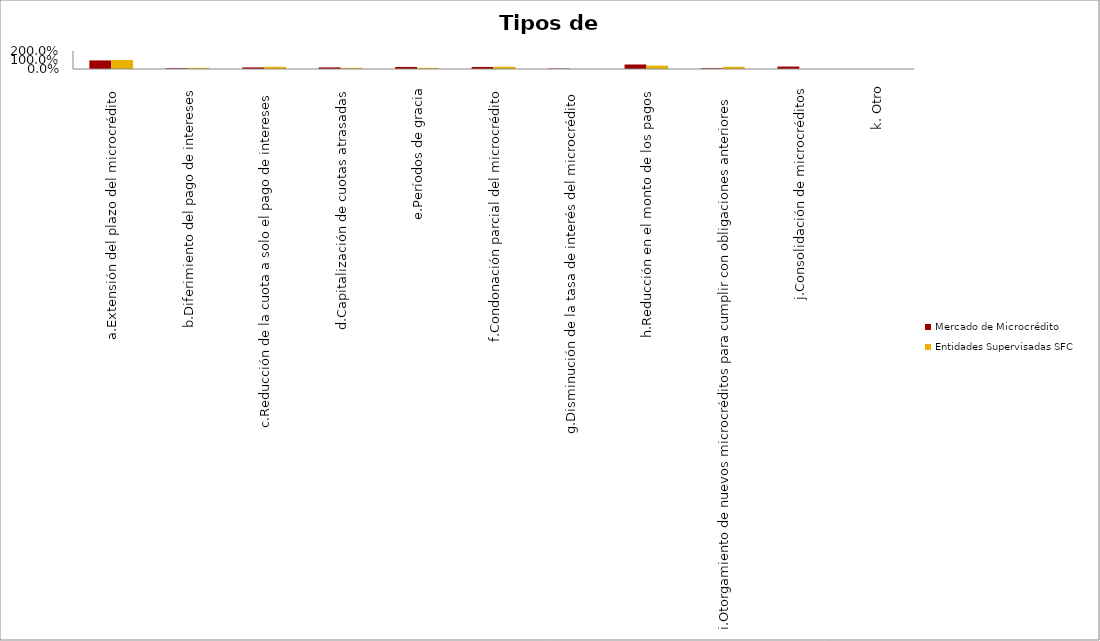
| Category | Mercado de Microcrédito | Entidades Supervisadas SFC |
|---|---|---|
| a.Extensión del plazo del microcrédito | 0.954 | 1 |
| b.Diferimiento del pago de intereses | 0.091 | 0.125 |
| c.Reducción de la cuota a solo el pago de intereses | 0.182 | 0.25 |
| d.Capitalización de cuotas atrasadas | 0.182 | 0.125 |
| e.Períodos de gracia | 0.227 | 0.125 |
| f.Condonación parcial del microcrédito | 0.227 | 0.25 |
| g.Disminución de la tasa de interés del microcrédito | 0.046 | 0 |
| h.Reducción en el monto de los pagos | 0.5 | 0.375 |
| i.Otorgamiento de nuevos microcréditos para cumplir con obligaciones anteriores | 0.091 | 0.25 |
| j.Consolidación de microcréditos | 0.273 | 0 |
| k. Otro | 0 | 0 |